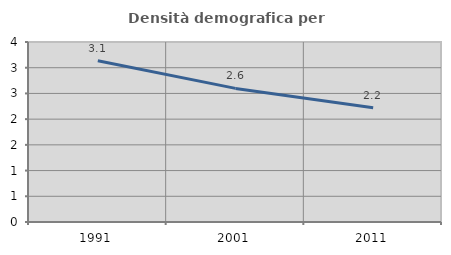
| Category | Densità demografica |
|---|---|
| 1991.0 | 3.136 |
| 2001.0 | 2.598 |
| 2011.0 | 2.222 |